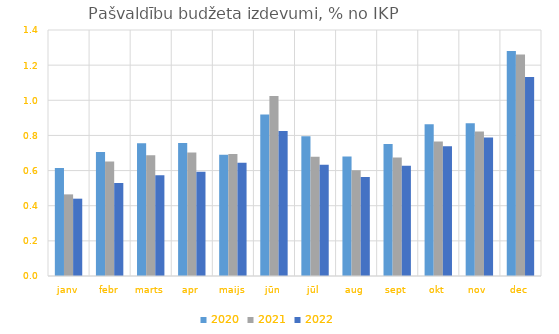
| Category | 2020 | 2021 | 2022 |
|---|---|---|---|
| janv | 0.614 | 0.465 | 0.44 |
| febr | 0.706 | 0.651 | 0.529 |
| marts | 0.756 | 0.686 | 0.573 |
| apr | 0.758 | 0.703 | 0.594 |
| maijs | 0.69 | 0.694 | 0.644 |
| jūn | 0.919 | 1.024 | 0.825 |
| jūl | 0.795 | 0.679 | 0.633 |
| aug | 0.68 | 0.602 | 0.563 |
| sept | 0.751 | 0.675 | 0.627 |
| okt | 0.864 | 0.766 | 0.739 |
| nov | 0.87 | 0.822 | 0.788 |
| dec | 1.281 | 1.26 | 1.133 |